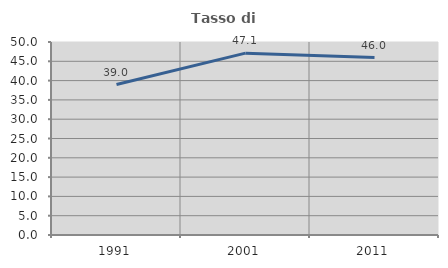
| Category | Tasso di occupazione   |
|---|---|
| 1991.0 | 38.971 |
| 2001.0 | 47.107 |
| 2011.0 | 45.968 |